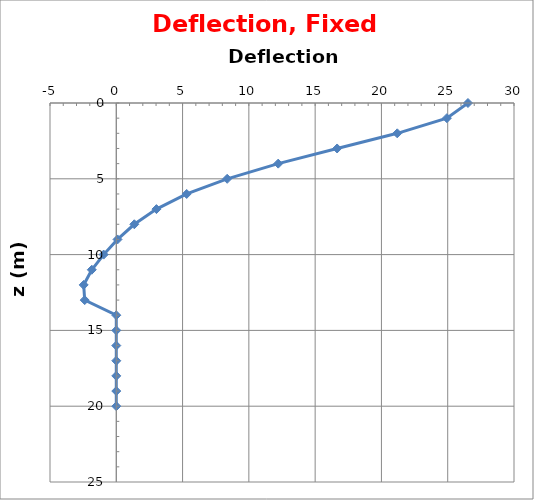
| Category | Series 0 |
|---|---|
| 26.529081659243243 | 0 |
| 24.937162087103733 | 1 |
| 21.193986075377342 | 2 |
| 16.65699025593191 | 3 |
| 12.213902082320015 | 4 |
| 8.366031748181257 | 5 |
| 5.311564105644458 | 6 |
| 3.0288505837298016 | 7 |
| 1.3597011067510665 | 8 |
| 0.09267601271798127 | 9 |
| -0.9536220282618431 | 10 |
| -1.847256095580385 | 11 |
| -2.4596630997273405 | 12 |
| -2.3823618638877404 | 13 |
| 0.0 | 14 |
| 0.0 | 15 |
| 0.0 | 16 |
| 0.0 | 17 |
| 0.0 | 18 |
| 0.0 | 19 |
| 0.0 | 20 |